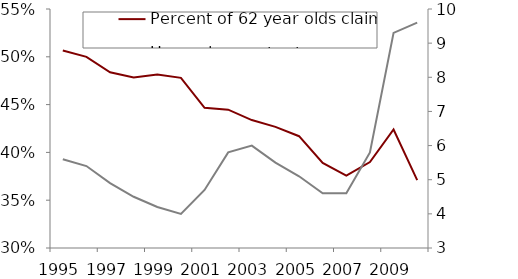
| Category | Percent of 62 year olds claiming |
|---|---|
| 1995.0 | 0.507 |
| 1996.0 | 0.5 |
| 1997.0 | 0.484 |
| 1998.0 | 0.478 |
| 1999.0 | 0.481 |
| 2000.0 | 0.478 |
| 2001.0 | 0.447 |
| 2002.0 | 0.445 |
| 2003.0 | 0.434 |
| 2004.0 | 0.427 |
| 2005.0 | 0.417 |
| 2006.0 | 0.389 |
| 2007.0 | 0.376 |
| 2008.0 | 0.39 |
| 2009.0 | 0.424 |
| 2010.0 | 0.371 |